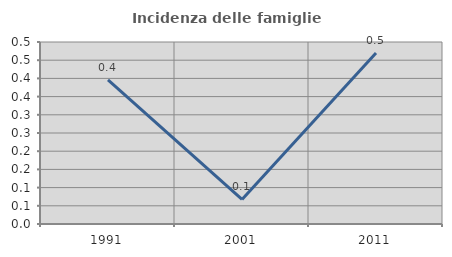
| Category | Incidenza delle famiglie numerose |
|---|---|
| 1991.0 | 0.396 |
| 2001.0 | 0.068 |
| 2011.0 | 0.469 |